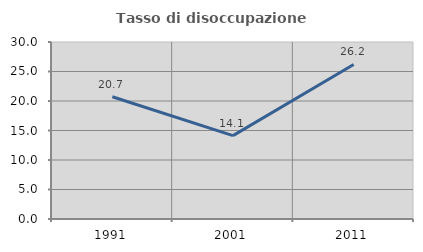
| Category | Tasso di disoccupazione giovanile  |
|---|---|
| 1991.0 | 20.718 |
| 2001.0 | 14.127 |
| 2011.0 | 26.199 |